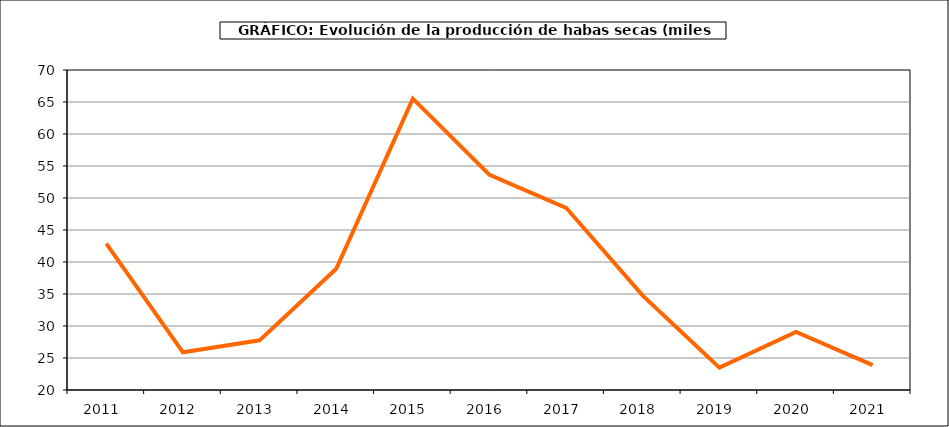
| Category | Producción |
|---|---|
| 2011.0 | 42.882 |
| 2012.0 | 25.888 |
| 2013.0 | 27.759 |
| 2014.0 | 38.941 |
| 2015.0 | 65.532 |
| 2016.0 | 53.625 |
| 2017.0 | 48.468 |
| 2018.0 | 34.75 |
| 2019.0 | 23.492 |
| 2020.0 | 29.066 |
| 2021.0 | 23.884 |